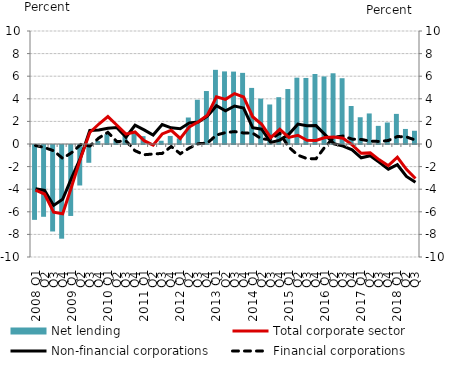
| Category | Net lending |
|---|---|
| 2008 Q1 | -6.625 |
| Q2 | -6.353 |
| Q3 | -7.652 |
| Q4 | -8.291 |
| 2009 Q1 | -6.28 |
| Q2 | -3.583 |
| Q3 | -1.573 |
| Q4 | 0.266 |
| 2010 Q1 | 0.868 |
| Q2 | 0.342 |
| Q3 | 0.707 |
| Q4 | 1.118 |
| 2011 Q1 | 0.698 |
| Q2 | -0.018 |
| Q3 | 0.289 |
| Q4 | 0.713 |
| 2012 Q1 | 0.498 |
| Q2 | 2.345 |
| Q3 | 3.916 |
| Q4 | 4.688 |
| 2013 Q1 | 6.563 |
| Q2 | 6.424 |
| Q3 | 6.407 |
| Q4 | 6.295 |
| 2014 Q1 | 4.964 |
| Q2 | 4.015 |
| Q3 | 3.498 |
| Q4 | 4.142 |
| 2015 Q1 | 4.864 |
| Q2 | 5.87 |
| Q3 | 5.844 |
| Q4 | 6.197 |
| 2016 Q1 | 5.979 |
| Q2 | 6.259 |
| Q3 | 5.823 |
| Q4 | 3.36 |
| 2017 Q1 | 2.368 |
| Q2 | 2.703 |
| Q3 | 1.605 |